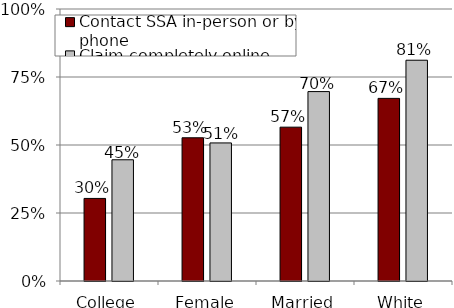
| Category | Contact SSA in-person or by phone | Claim completely online |
|---|---|---|
| College | 0.304 | 0.446 |
| Female | 0.527 | 0.508 |
| Married | 0.566 | 0.696 |
| White | 0.671 | 0.812 |